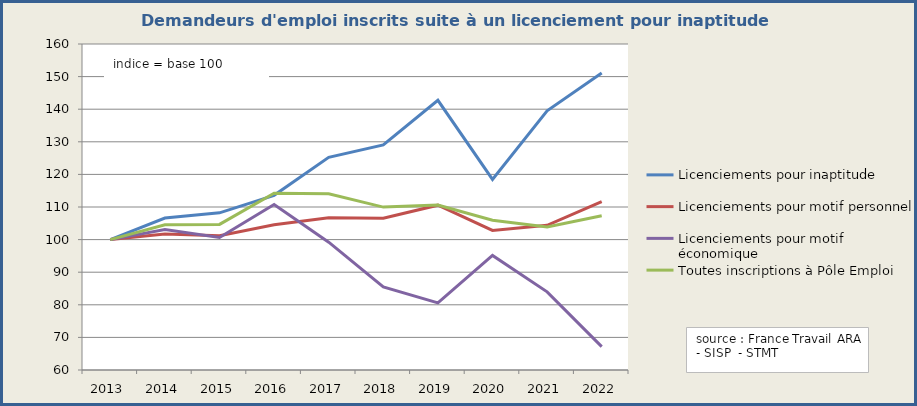
| Category | Licenciements pour inaptitude | Licenciements pour motif personnel | Licenciements pour motif économique | Toutes inscriptions à Pôle Emploi |
|---|---|---|---|---|
| 2013.0 | 100 | 100 | 100 | 100 |
| 2014.0 | 106.627 | 101.735 | 103.096 | 104.518 |
| 2015.0 | 108.211 | 101.187 | 100.667 | 104.663 |
| 2016.0 | 113.583 | 104.54 | 110.78 | 114.224 |
| 2017.0 | 125.243 | 106.701 | 99.216 | 114.038 |
| 2018.0 | 129.055 | 106.542 | 85.503 | 109.966 |
| 2019.0 | 142.728 | 110.561 | 80.59 | 110.622 |
| 2020.0 | 118.457 | 102.821 | 95.158 | 105.948 |
| 2021.0 | 139.516 | 104.377 | 83.971 | 103.873 |
| 2022.0 | 151.108 | 111.637 | 67.172 | 107.291 |